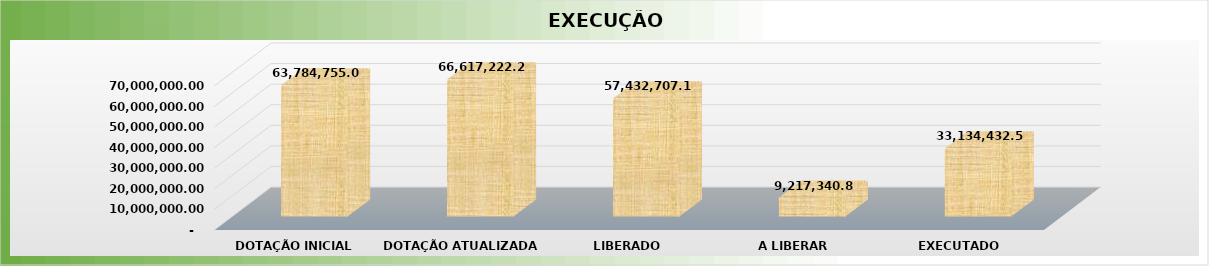
| Category | Series 0 |
|---|---|
| 0 | 63784755 |
| 1 | 66617222.23 |
| 2 | 57432707.18 |
| 3 | 9217340.83 |
| 4 | 33134432.55 |